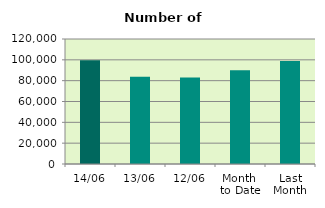
| Category | Series 0 |
|---|---|
| 14/06 | 99634 |
| 13/06 | 83674 |
| 12/06 | 83028 |
| Month 
to Date | 89989.2 |
| Last
Month | 98885.545 |